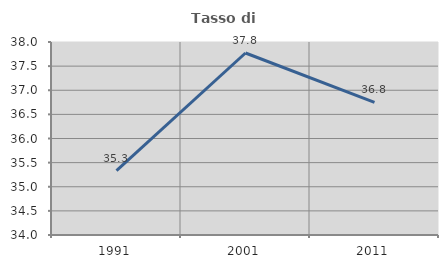
| Category | Tasso di occupazione   |
|---|---|
| 1991.0 | 35.334 |
| 2001.0 | 37.772 |
| 2011.0 | 36.75 |